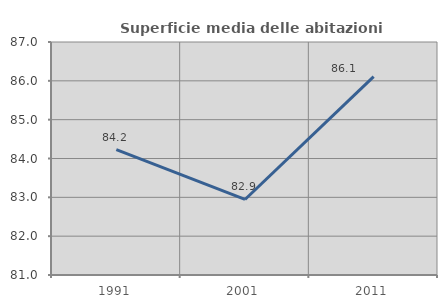
| Category | Superficie media delle abitazioni occupate |
|---|---|
| 1991.0 | 84.226 |
| 2001.0 | 82.945 |
| 2011.0 | 86.11 |